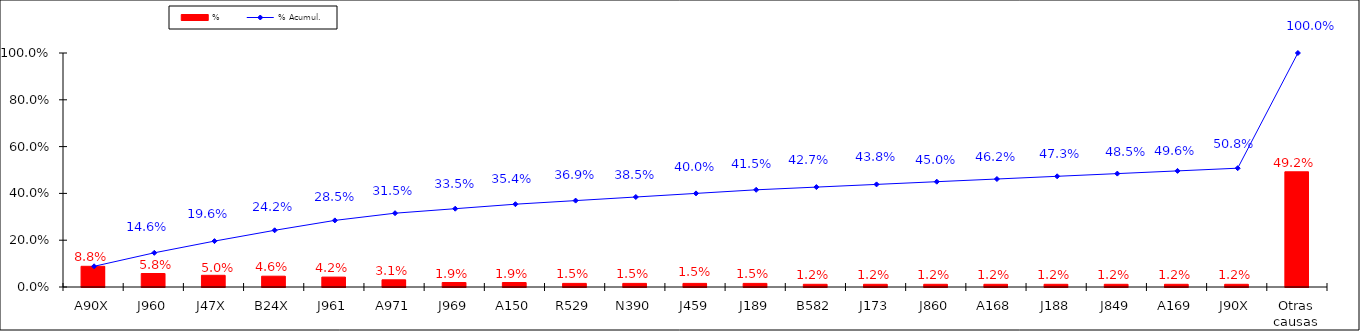
| Category | % |
|---|---|
| A90X | 0.088 |
| J960 | 0.058 |
| J47X | 0.05 |
| B24X | 0.046 |
| J961 | 0.042 |
| A971 | 0.031 |
| J969 | 0.019 |
| A150 | 0.019 |
| R529 | 0.015 |
| N390 | 0.015 |
| J459 | 0.015 |
| J189 | 0.015 |
| B582 | 0.012 |
| J173 | 0.012 |
| J860 | 0.012 |
| A168 | 0.012 |
| J188 | 0.012 |
| J849 | 0.012 |
| A169 | 0.012 |
| J90X | 0.012 |
| Otras causas | 0.492 |